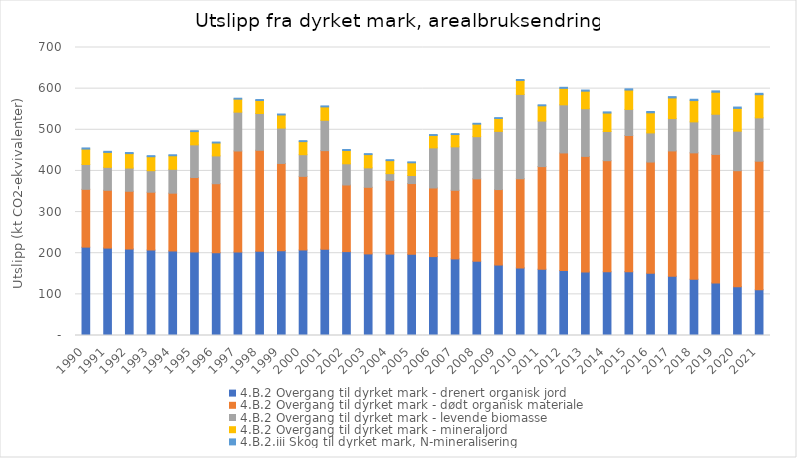
| Category | 4.B.2 Overgang til dyrket mark - drenert organisk jord | 4.B.2 Overgang til dyrket mark - dødt organisk materiale | 4.B.2 Overgang til dyrket mark - levende biomasse | 4.B.2 Overgang til dyrket mark - mineraljord | 4.B.2.iii Skog til dyrket mark, N-mineralisering |
|---|---|---|---|---|---|
| 1990.0 | 214.8 | 140.485 | 60.414 | 37.364 | 2.796 |
| 1991.0 | 212.459 | 140.485 | 55.75 | 36.248 | 2.703 |
| 1992.0 | 210.117 | 140.485 | 56.359 | 35.133 | 2.613 |
| 1993.0 | 207.775 | 140.485 | 52.303 | 34.018 | 2.52 |
| 1994.0 | 205.434 | 140.485 | 58.043 | 32.903 | 2.43 |
| 1995.0 | 203.092 | 180.952 | 79.321 | 32.148 | 2.366 |
| 1996.0 | 201.186 | 167.74 | 67.564 | 31.393 | 2.3 |
| 1997.0 | 202.859 | 245.595 | 94.427 | 31.54 | 2.313 |
| 1998.0 | 204.533 | 245.595 | 89.393 | 31.687 | 2.327 |
| 1999.0 | 206.207 | 211.96 | 85.968 | 31.838 | 2.337 |
| 2000.0 | 207.881 | 178.908 | 52.712 | 31.732 | 2.332 |
| 2001.0 | 209.554 | 239.777 | 73.737 | 32.573 | 2.396 |
| 2002.0 | 203.918 | 161.922 | 51.472 | 32.4 | 2.385 |
| 2003.0 | 198.282 | 161.922 | 47.242 | 32.227 | 2.374 |
| 2004.0 | 197.868 | 179.317 | 16.223 | 31.627 | 2.329 |
| 2005.0 | 197.453 | 171.902 | 19.462 | 30.923 | 2.276 |
| 2006.0 | 191.817 | 166.747 | 97.445 | 30.189 | 2.223 |
| 2007.0 | 186.181 | 166.747 | 105.623 | 29.904 | 2.168 |
| 2008.0 | 180.545 | 200.189 | 102.543 | 30.369 | 2.154 |
| 2009.0 | 171.254 | 183.468 | 141.386 | 31.31 | 2.157 |
| 2010.0 | 164.305 | 216.91 | 204.775 | 33.897 | 2.292 |
| 2011.0 | 161.011 | 249.493 | 110.713 | 37.045 | 2.427 |
| 2012.0 | 157.717 | 286.014 | 116.93 | 40.017 | 2.584 |
| 2013.0 | 154.422 | 280.859 | 115.912 | 42.657 | 2.732 |
| 2014.0 | 154.783 | 270.153 | 70.881 | 44.821 | 2.862 |
| 2015.0 | 155.143 | 331.022 | 63.327 | 47.054 | 3 |
| 2016.0 | 151.414 | 270.153 | 70.795 | 48.936 | 3.103 |
| 2017.0 | 144.104 | 304.533 | 78.537 | 50.276 | 3.159 |
| 2018.0 | 136.795 | 307.111 | 75.298 | 51.78 | 3.217 |
| 2019.0 | 127.658 | 312.464 | 97.64 | 53.52 | 3.283 |
| 2020.0 | 118.521 | 282.029 | 96.077 | 55.3 | 3.355 |
| 2021.0 | 111.211 | 312.464 | 105.299 | 56.31 | 3.368 |